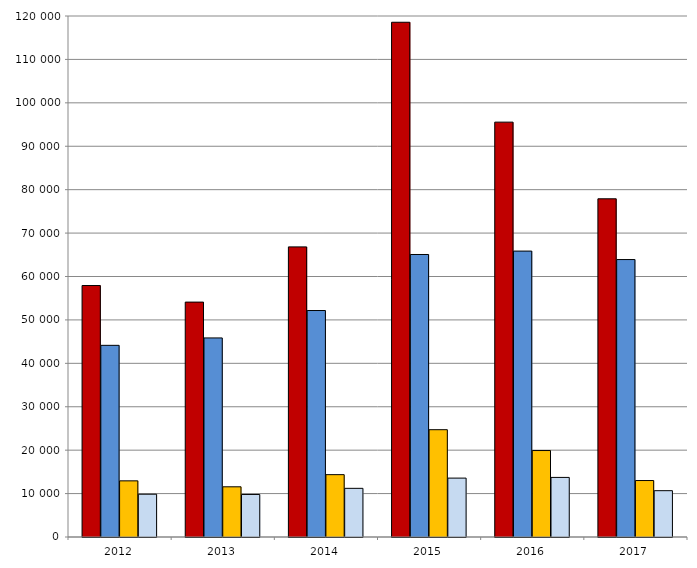
| Category | Steuerpflichtiger Erwerb | Festgesetzte Steuer |
|---|---|---|
| 2012.0 | 44147 | 9856 |
| 2013.0 | 45850 | 9797 |
| 2014.0 | 52165 | 11210 |
| 2015.0 | 65070.252 | 13565.313 |
| 2016.0 | 65853.894 | 13723.639 |
| 2017.0 | 63903.199 | 10667.76 |